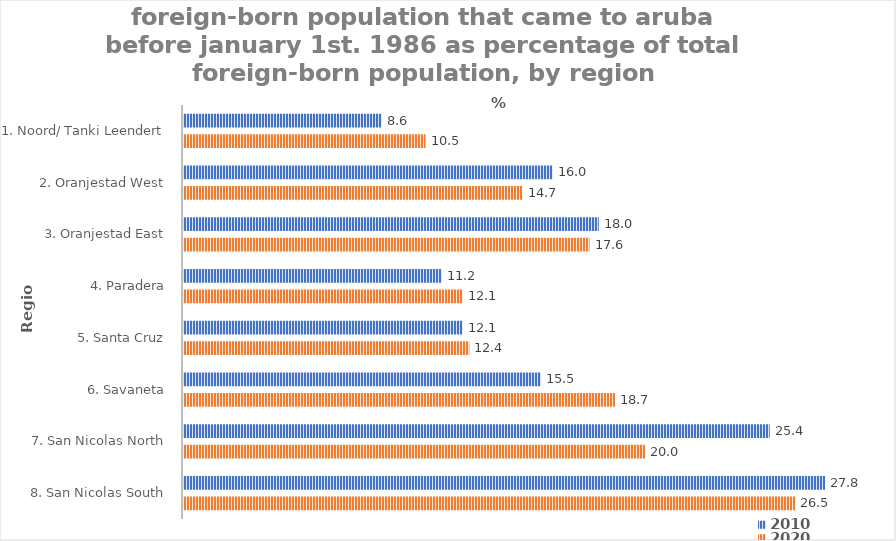
| Category | 2010 | 2020 |
|---|---|---|
| 1. Noord/ Tanki Leendert | 8.6 | 10.5 |
| 2. Oranjestad West | 16 | 14.7 |
| 3. Oranjestad East | 18 | 17.6 |
| 4. Paradera | 11.2 | 12.1 |
| 5. Santa Cruz | 12.1 | 12.4 |
| 6. Savaneta | 15.5 | 18.7 |
| 7. San Nicolas North | 25.4 | 20 |
| 8. San Nicolas South | 27.8 | 26.5 |